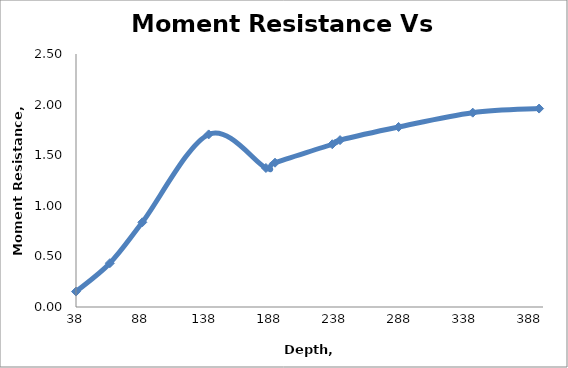
| Category | Moment Resistance Vs Depth  |
|---|---|
| 38.0 | 0.153 |
| 64.0 | 0.433 |
| 89.0 | 0.837 |
| 140.0 | 1.705 |
| 184.0 | 1.374 |
| 191.0 | 1.426 |
| 235.0 | 1.608 |
| 241.0 | 1.649 |
| 286.0 | 1.779 |
| 343.0 | 1.92 |
| 394.0 | 1.961 |